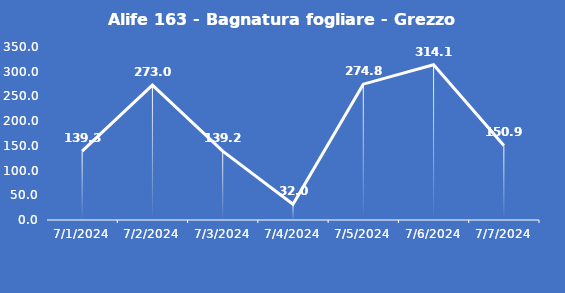
| Category | Alife 163 - Bagnatura fogliare - Grezzo (min) |
|---|---|
| 7/1/24 | 139.3 |
| 7/2/24 | 273 |
| 7/3/24 | 139.2 |
| 7/4/24 | 32 |
| 7/5/24 | 274.8 |
| 7/6/24 | 314.1 |
| 7/7/24 | 150.9 |